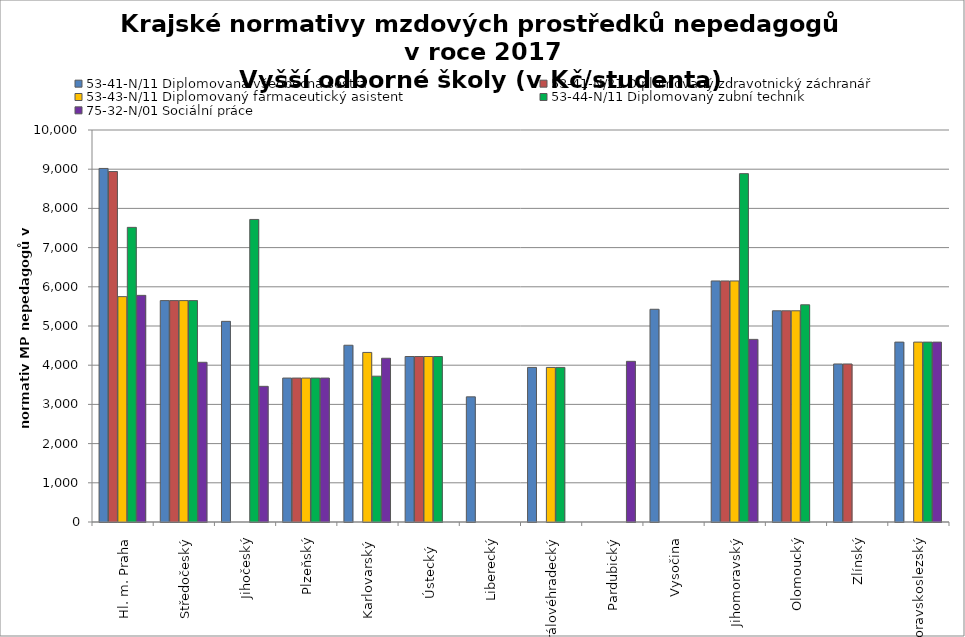
| Category | 53-41-N/11 Diplomovaná všeobecná sestra | 53-41-N/21 Diplomovaný zdravotnický záchranář | 53-43-N/11 Diplomovaný farmaceutický asistent | 53-44-N/11 Diplomovaný zubní technik | 75-32-N/01 Sociální práce |
|---|---|---|---|---|---|
| Hl. m. Praha | 9019.2 | 8940.523 | 5749.108 | 7516 | 5781.538 |
| Středočeský | 5647.815 | 5647.815 | 5647.815 | 5647.815 | 4074.397 |
| Jihočeský | 5118.527 | 0 | 0 | 7718.306 | 3460.81 |
| Plzeňský | 3672.226 | 3672.226 | 3672.226 | 3672.226 | 3672.226 |
| Karlovarský  | 4509.091 | 0 | 4325.581 | 3720 | 4176.959 |
| Ústecký   | 4221.6 | 4221.6 | 4221.6 | 4221.6 | 0 |
| Liberecký | 3192.757 | 0 | 0 | 0 | 0 |
| Královéhradecký | 3943.066 | 0 | 3943.066 | 3943.066 | 0 |
| Pardubický | 0 | 0 | 0 | 0 | 4098.692 |
| Vysočina | 5426.641 | 0 | 0 | 0 | 0 |
| Jihomoravský | 6148.92 | 6148.92 | 6148.92 | 8886.891 | 4658.639 |
| Olomoucký | 5388.06 | 5388.06 | 5388.06 | 5541.217 | 0 |
| Zlínský | 4031.28 | 4031.28 | 0 | 0 | 0 |
| Moravskoslezský | 4589.389 | 0 | 4589.389 | 4589.389 | 4589.389 |